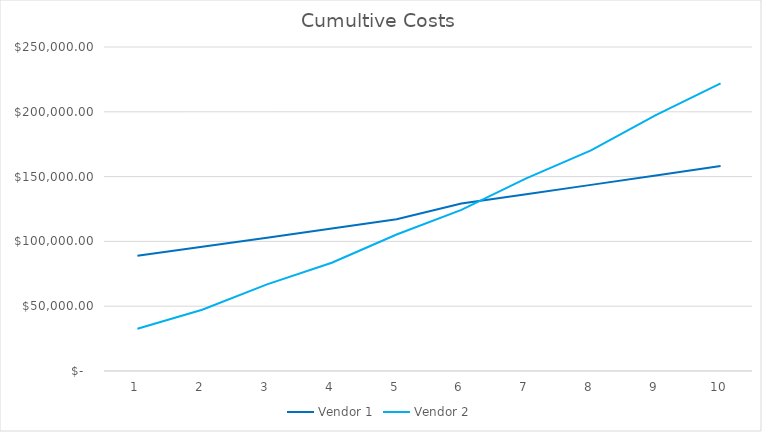
| Category | Vendor 1 | Vendor 2 |
|---|---|---|
| 0 | 88900 | 32600 |
| 1 | 95900 | 47272 |
| 2 | 102900 | 66844.64 |
| 3 | 110000 | 83507.597 |
| 4 | 117100 | 105328.308 |
| 5 | 129200 | 124262.313 |
| 6 | 136410 | 148647.165 |
| 7 | 143620 | 170174.132 |
| 8 | 150830 | 197486.34 |
| 9 | 158161 | 221976.818 |